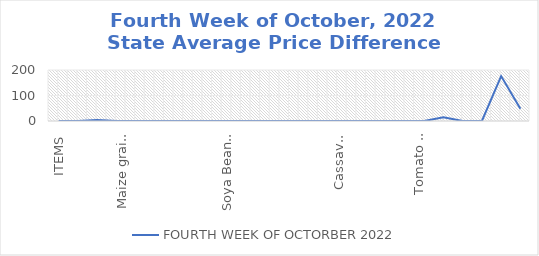
| Category | FOURTH WEEK OF OCTORBER 2022 |
|---|---|
| ITEMS | 0 |
| Rice, Imported, High Quality Sold loose  (1 mudu) | 0 |
| Rice, Agric Sold Loose(Low quality) imported  (1 mudu) | 4.348 |
| Rice Local, Sold Loose   (1 mudu) | 0 |
| Maize grain, white sold loose   (1 mudu) | 0 |
| Maize grain, yellow sold loose   (1 mudu) | 0 |
| Sorghum (Guinea Corn) white or brown, sold loose   (1 mudu) | 0 |
| millet (jero or maiwa) sold loose   (1 mudu) | 0 |
| Beans: white black eye. Sold loose   (1 mudu) | 0 |
| Beans Brown, sold loose  (1 mudu) | 0 |
| Soya Beans, sold loose    (1 mudu) | 0 |
| Gari White, sold loose  (1 mudu) | 0 |
| Gari Yellow, sold loose   (1 mudu) | 0 |
| Palm oil (1 schnap bottle) | 0 |
| Yam tuber (1 Medium Size) | 0 |
| Cassava tuber | 0 |
| Irish potato  (4 Litre rubber) | 0 |
| Sweet potato  (5 Medium Size) | 0 |
| Local live chicken  | 0 |
| Groundnut - shelled (fresh) | 0 |
| Tomato fresh   (4 Litre rubber) | 14.348 |
| Okro fresh     (1 mudu) | 0 |
| Okro dried    (1 mudu) | 0 |
| Onion   (4 Litre rubber) | 176.087 |
| Pepper fresh   (4 Litre rubber) | 47.826 |